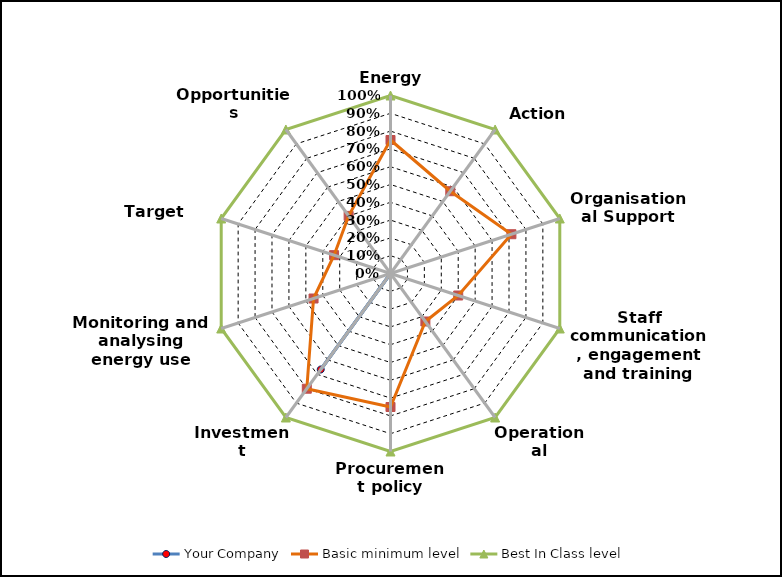
| Category | Your Company | Basic minimum level | Best In Class level |
|---|---|---|---|
| Energy policy | 0 | 0.75 | 1 |
| Action Plan | 0 | 0.571 | 1 |
| Organisational Support | 0 | 0.714 | 1 |
| Staff communication, engagement and training | 0 | 0.4 | 1 |
| Operational procedures | 0 | 0.333 | 1 |
| Procurement policy | 0 | 0.75 | 1 |
| Investment procedures | 0.667 | 0.8 | 1 |
| Monitoring and analysing energy use | 0 | 0.455 | 1 |
| Target setting | 0 | 0.333 | 1 |
| Opportunities identification | 0 | 0.4 | 1 |